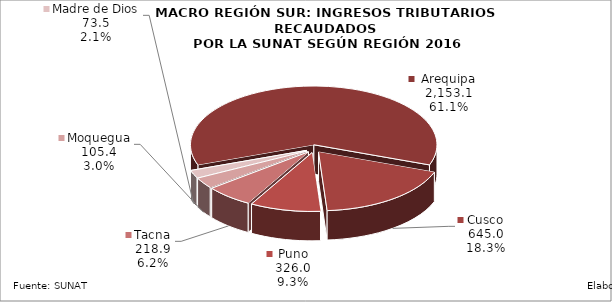
| Category | 2016 |
|---|---|
| Arequipa | 2153.066 |
| Cusco | 645.038 |
| Puno | 325.99 |
| Tacna | 218.94 |
| Moquegua | 105.387 |
| Madre de Dios | 73.527 |